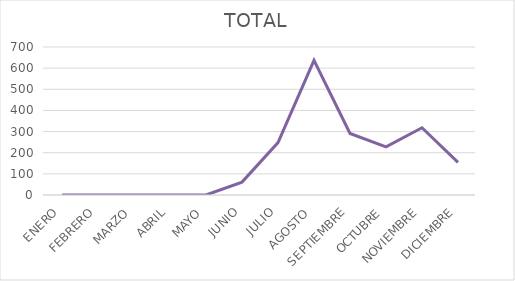
| Category | TOTAL |
|---|---|
| ENERO | 0 |
| FEBRERO | 0 |
| MARZO | 0 |
| ABRIL | 0 |
| MAYO | 0 |
| JUNIO | 61 |
| JULIO | 248 |
| AGOSTO | 637 |
| SEPTIEMBRE | 291 |
| OCTUBRE | 228 |
| NOVIEMBRE | 318 |
| DICIEMBRE | 154 |